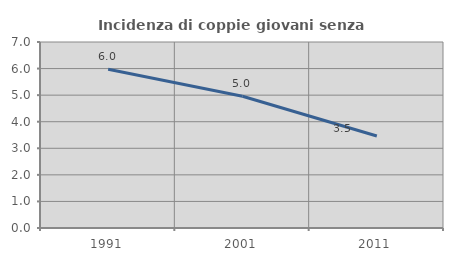
| Category | Incidenza di coppie giovani senza figli |
|---|---|
| 1991.0 | 5.975 |
| 2001.0 | 4.956 |
| 2011.0 | 3.463 |